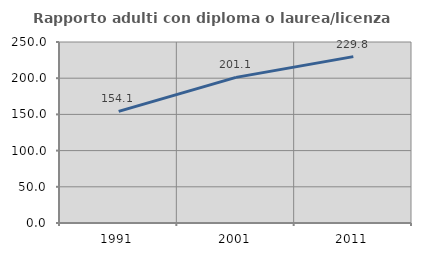
| Category | Rapporto adulti con diploma o laurea/licenza media  |
|---|---|
| 1991.0 | 154.123 |
| 2001.0 | 201.113 |
| 2011.0 | 229.79 |